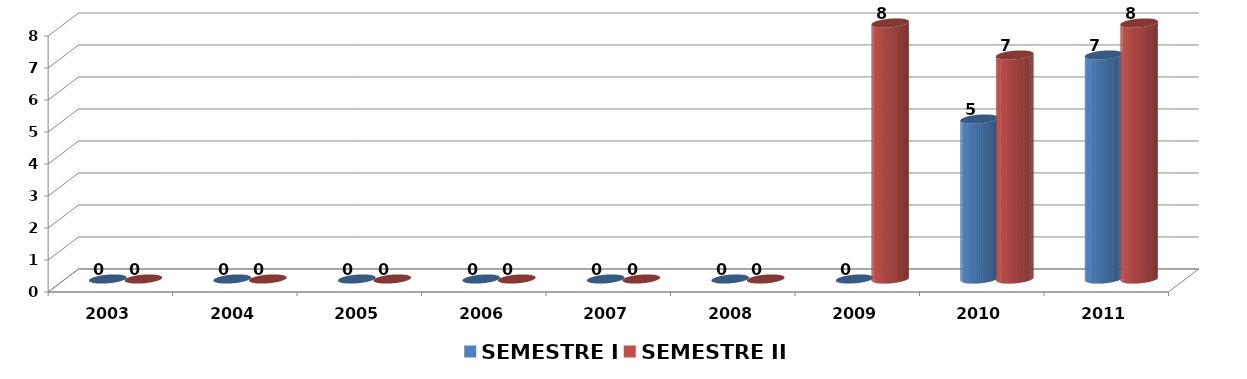
| Category | SEMESTRE I | SEMESTRE II |
|---|---|---|
| 2003.0 | 0 | 0 |
| 2004.0 | 0 | 0 |
| 2005.0 | 0 | 0 |
| 2006.0 | 0 | 0 |
| 2007.0 | 0 | 0 |
| 2008.0 | 0 | 0 |
| 2009.0 | 0 | 8 |
| 2010.0 | 5 | 7 |
| 2011.0 | 7 | 8 |